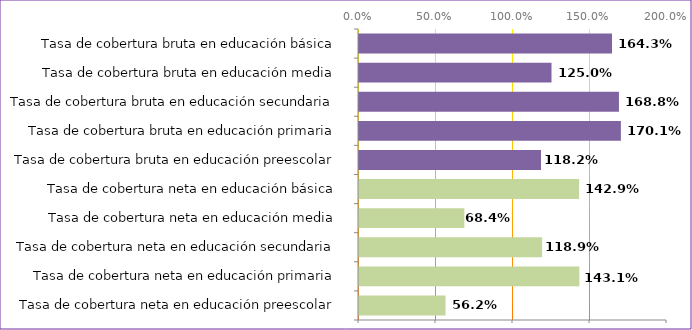
| Category | Series 0 |
|---|---|
| Tasa de cobertura neta en educación preescolar | 0.562 |
| Tasa de cobertura neta en educación primaria | 1.431 |
| Tasa de cobertura neta en educación secundaria | 1.189 |
| Tasa de cobertura neta en educación media | 0.684 |
| Tasa de cobertura neta en educación básica | 1.429 |
| Tasa de cobertura bruta en educación preescolar | 1.182 |
| Tasa de cobertura bruta en educación primaria | 1.7 |
| Tasa de cobertura bruta en educación secundaria | 1.688 |
| Tasa de cobertura bruta en educación media | 1.25 |
| Tasa de cobertura bruta en educación básica | 1.643 |